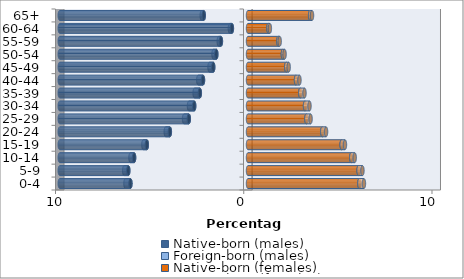
| Category | Native-born (males) | Foreign-born (males) | Native-born (females) | Foreign-born (females) |
|---|---|---|---|---|
| 0-4 | -6.246 | -0.264 | 5.914 | 0.245 |
| 5-9 | -6.359 | -0.217 | 5.874 | 0.205 |
| 10-14 | -6.051 | -0.193 | 5.484 | 0.184 |
| 15-19 | -5.374 | -0.185 | 4.974 | 0.177 |
| 20-24 | -4.151 | -0.218 | 3.945 | 0.202 |
| 25-29 | -3.144 | -0.253 | 3.1 | 0.224 |
| 30-34 | -2.859 | -0.276 | 3.029 | 0.237 |
| 35-39 | -2.558 | -0.278 | 2.776 | 0.225 |
| 40-44 | -2.392 | -0.25 | 2.55 | 0.183 |
| 45-49 | -1.848 | -0.197 | 2.031 | 0.13 |
| 50-54 | -1.683 | -0.149 | 1.853 | 0.089 |
| 55-59 | -1.439 | -0.115 | 1.611 | 0.072 |
| 60-64 | -0.855 | -0.108 | 1.085 | 0.077 |
| 65+ | -2.351 | -0.106 | 3.301 | 0.1 |